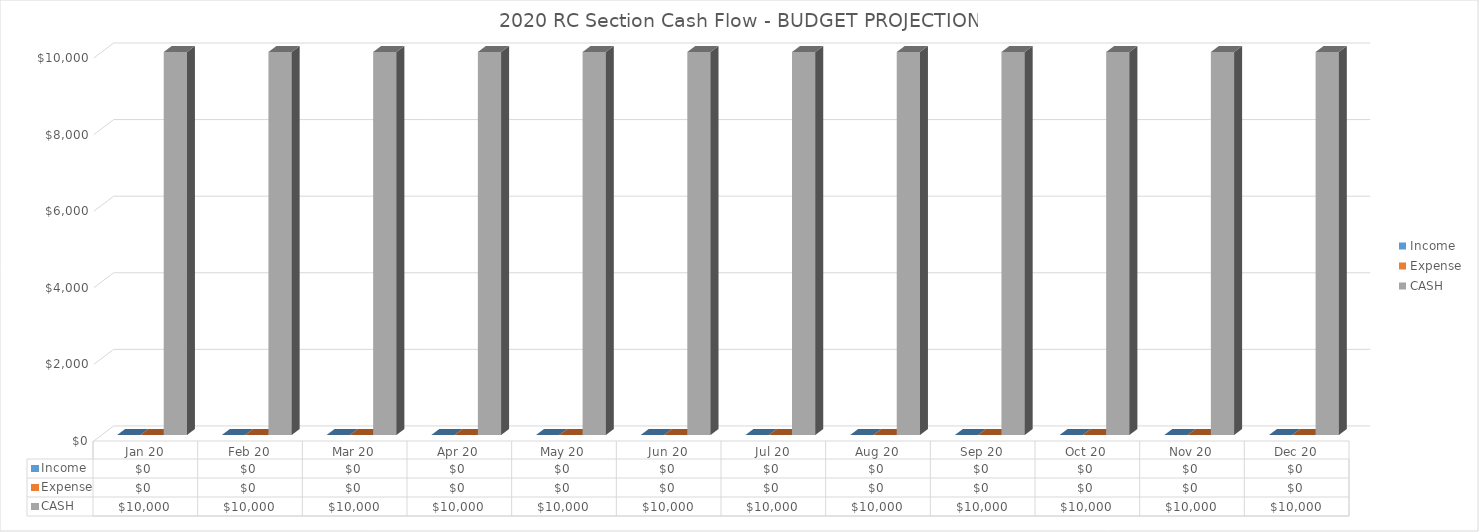
| Category | Income | Expense | CASH |
|---|---|---|---|
| Jan 20 | 0 | 0 | 10000 |
| Feb 20 | 0 | 0 | 10000 |
| Mar 20 | 0 | 0 | 10000 |
| Apr 20 | 0 | 0 | 10000 |
| May 20 | 0 | 0 | 10000 |
| Jun 20 | 0 | 0 | 10000 |
| Jul 20 | 0 | 0 | 10000 |
| Aug 20 | 0 | 0 | 10000 |
| Sep 20 | 0 | 0 | 10000 |
| Oct 20 | 0 | 0 | 10000 |
| Nov 20 | 0 | 0 | 10000 |
| Dec 20 | 0 | 0 | 10000 |